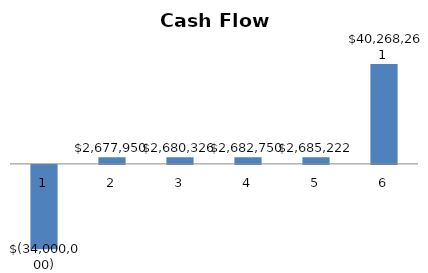
| Category | Series 0 |
|---|---|
| 0 | -34000000 |
| 1 | 2677950 |
| 2 | 2680326 |
| 3 | 2682749.52 |
| 4 | 2685221.51 |
| 5 | 40268261.49 |